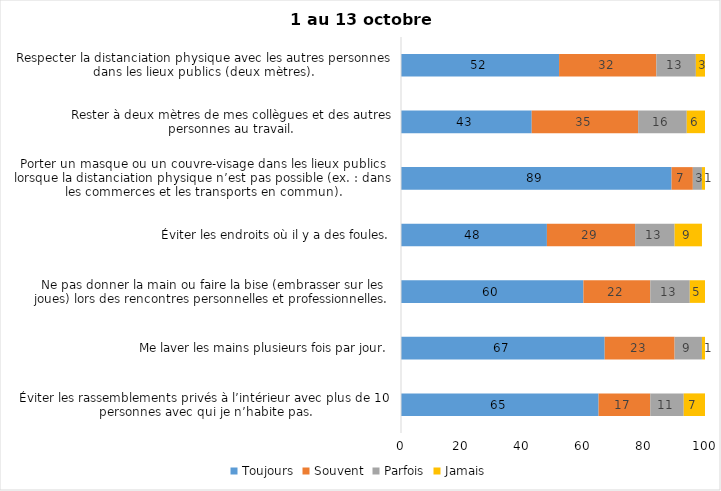
| Category | Toujours | Souvent | Parfois | Jamais |
|---|---|---|---|---|
| Éviter les rassemblements privés à l’intérieur avec plus de 10 personnes avec qui je n’habite pas. | 65 | 17 | 11 | 7 |
| Me laver les mains plusieurs fois par jour. | 67 | 23 | 9 | 1 |
| Ne pas donner la main ou faire la bise (embrasser sur les joues) lors des rencontres personnelles et professionnelles. | 60 | 22 | 13 | 5 |
| Éviter les endroits où il y a des foules. | 48 | 29 | 13 | 9 |
| Porter un masque ou un couvre-visage dans les lieux publics lorsque la distanciation physique n’est pas possible (ex. : dans les commerces et les transports en commun). | 89 | 7 | 3 | 1 |
| Rester à deux mètres de mes collègues et des autres personnes au travail. | 43 | 35 | 16 | 6 |
| Respecter la distanciation physique avec les autres personnes dans les lieux publics (deux mètres). | 52 | 32 | 13 | 3 |